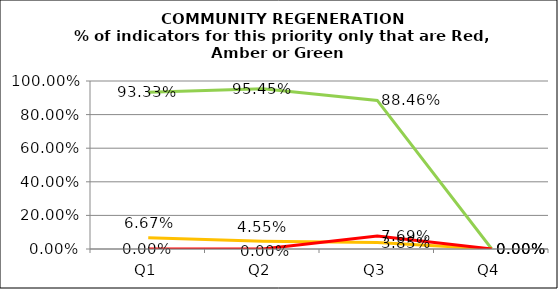
| Category | Green | Amber | Red |
|---|---|---|---|
| Q1 | 0.933 | 0.067 | 0 |
| Q2 | 0.955 | 0.045 | 0 |
| Q3 | 0.885 | 0.038 | 0.077 |
| Q4 | 0 | 0 | 0 |